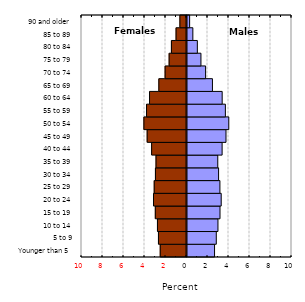
| Category | Series 0 |
|---|---|
| Younger than 5 | 2.624 |
| 5 to 9 | 2.789 |
| 10 to 14 | 2.949 |
| 15 to 19 | 3.144 |
| 20 to 24 | 3.258 |
| 25 to 29 | 3.135 |
| 30 to 34 | 3.008 |
| 35 to 39 | 2.931 |
| 40 to 44 | 3.344 |
| 45 to 49 | 3.714 |
| 50 to 54 | 3.98 |
| 55 to 59 | 3.655 |
| 60 to 64 | 3.35 |
| 65 to 69 | 2.423 |
| 70 to 74 | 1.771 |
| 75 to 79 | 1.328 |
| 80 to 84 | 0.985 |
| 85 to 89 | 0.557 |
| 90 and older | 0.25 |